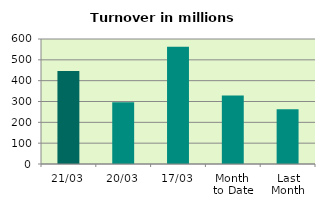
| Category | Series 0 |
|---|---|
| 21/03 | 445.818 |
| 20/03 | 296.394 |
| 17/03 | 563.148 |
| Month 
to Date | 329.223 |
| Last
Month | 263.32 |